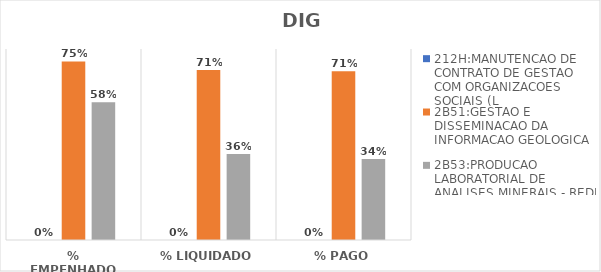
| Category | 212H:MANUTENCAO DE CONTRATO DE GESTAO COM ORGANIZACOES SOCIAIS (L | 2B51:GESTAO E DISSEMINACAO DA INFORMACAO GEOLOGICA | 2B53:PRODUCAO LABORATORIAL DE ANALISES MINERAIS - REDE LAMIN |
|---|---|---|---|
| % EMPENHADO | 0 | 0.748 | 0.577 |
| % LIQUIDADO | 0 | 0.712 | 0.36 |
| % PAGO | 0 | 0.707 | 0.339 |